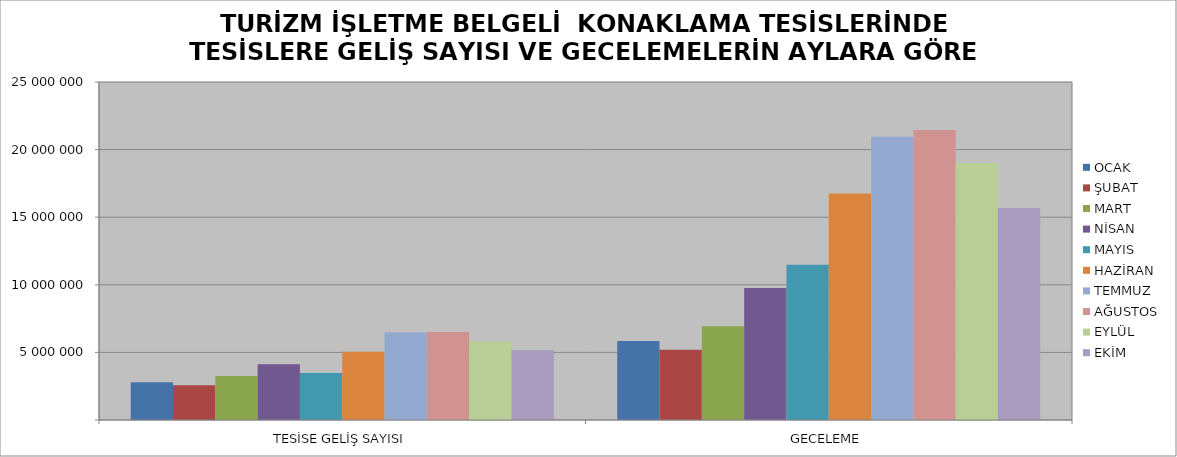
| Category | OCAK | ŞUBAT | MART | NİSAN | MAYIS | HAZİRAN | TEMMUZ | AĞUSTOS | EYLÜL | EKİM |
|---|---|---|---|---|---|---|---|---|---|---|
| TESİSE GELİŞ SAYISI | 2792196 | 2573999 | 3258929 | 4119434 | 3468117 | 5043280 | 6471045 | 6513976 | 5800131 | 5161194 |
| GECELEME | 5837753 | 5199578 | 6939659 | 9767435 | 11484758 | 16745602 | 20944829 | 21446796 | 19007595 | 15688416 |